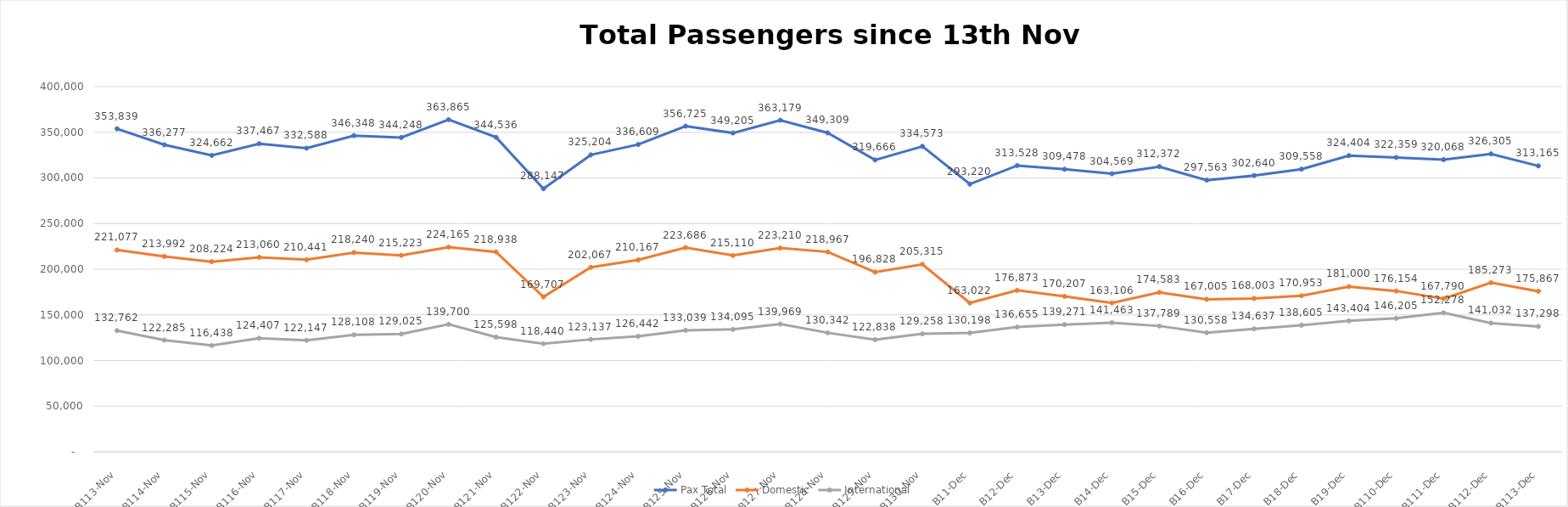
| Category | Pax Total |  Domestic  |  International  |
|---|---|---|---|
| 2022-11-13 | 353839 | 221077 | 132762 |
| 2022-11-14 | 336277 | 213992 | 122285 |
| 2022-11-15 | 324662 | 208224 | 116438 |
| 2022-11-16 | 337467 | 213060 | 124407 |
| 2022-11-17 | 332588 | 210441 | 122147 |
| 2022-11-18 | 346348 | 218240 | 128108 |
| 2022-11-19 | 344248 | 215223 | 129025 |
| 2022-11-20 | 363865 | 224165 | 139700 |
| 2022-11-21 | 344536 | 218938 | 125598 |
| 2022-11-22 | 288147 | 169707 | 118440 |
| 2022-11-23 | 325204 | 202067 | 123137 |
| 2022-11-24 | 336609 | 210167 | 126442 |
| 2022-11-25 | 356725 | 223686 | 133039 |
| 2022-11-26 | 349205 | 215110 | 134095 |
| 2022-11-27 | 363179 | 223210 | 139969 |
| 2022-11-28 | 349309 | 218967 | 130342 |
| 2022-11-29 | 319666 | 196828 | 122838 |
| 2022-11-30 | 334573 | 205315 | 129258 |
| 2022-12-01 | 293220 | 163022 | 130198 |
| 2022-12-02 | 313528 | 176873 | 136655 |
| 2022-12-03 | 309478 | 170207 | 139271 |
| 2022-12-04 | 304569 | 163106 | 141463 |
| 2022-12-05 | 312372 | 174583 | 137789 |
| 2022-12-06 | 297563 | 167005 | 130558 |
| 2022-12-07 | 302640 | 168003 | 134637 |
| 2022-12-08 | 309558 | 170953 | 138605 |
| 2022-12-09 | 324404 | 181000 | 143404 |
| 2022-12-10 | 322359 | 176154 | 146205 |
| 2022-12-11 | 320068 | 167790 | 152278 |
| 2022-12-12 | 326305 | 185273 | 141032 |
| 2022-12-13 | 313165 | 175867 | 137298 |